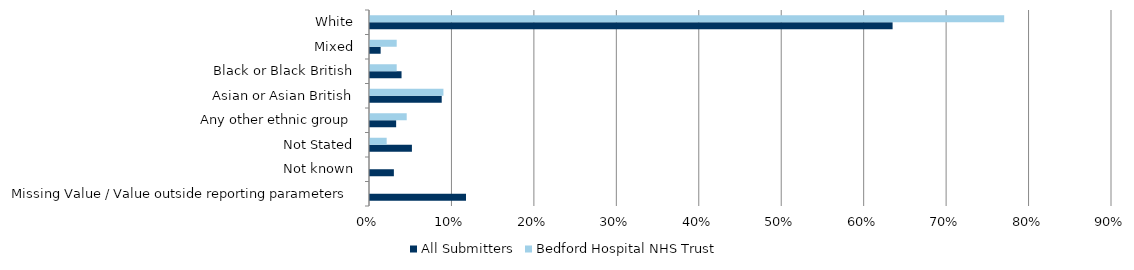
| Category | All Submitters | Bedford Hospital NHS Trust |
|---|---|---|
| Missing Value / Value outside reporting parameters | 0.116 | 0 |
| Not known | 0.029 | 0 |
| Not Stated | 0.051 | 0.02 |
| Any other ethnic group | 0.032 | 0.045 |
| Asian or Asian British | 0.087 | 0.089 |
| Black or Black British | 0.038 | 0.032 |
| Mixed | 0.013 | 0.032 |
| White | 0.634 | 0.769 |